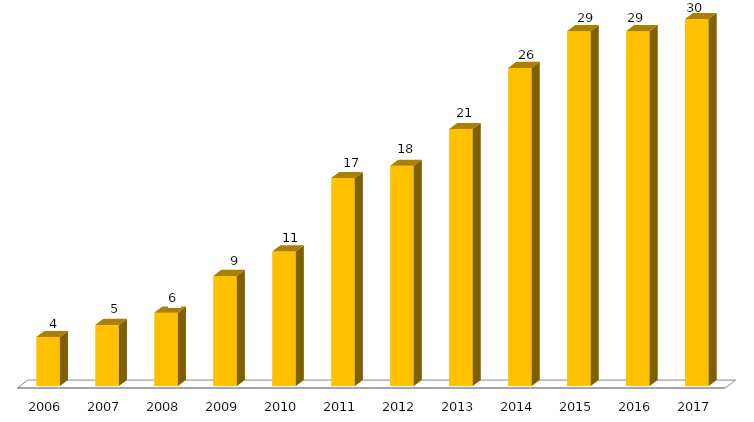
| Category | Pós - Gradução UFGD |
|---|---|
| 0 | 4 |
| 1 | 5 |
| 2 | 6 |
| 3 | 9 |
| 4 | 11 |
| 5 | 17 |
| 6 | 18 |
| 7 | 21 |
| 8 | 26 |
| 9 | 29 |
| 10 | 29 |
| 11 | 30 |